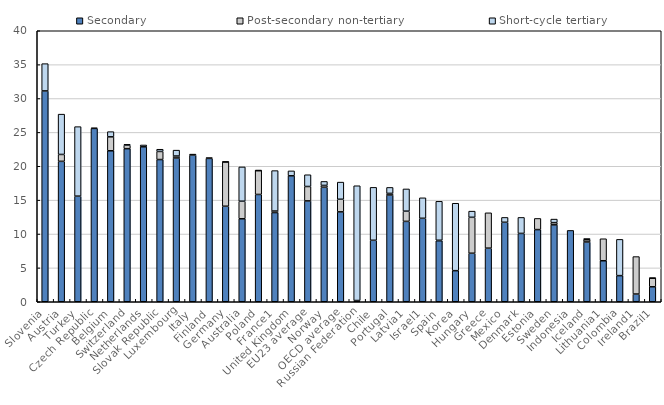
| Category | Secondary | Post-secondary non-tertiary | Short-cycle tertiary |
|---|---|---|---|
| Slovenia | 31.117 | 0 | 4.028 |
| Austria | 20.726 | 1.015 | 5.95 |
| Turkey | 15.587 | 0 | 10.261 |
| Czech Republic | 25.586 | 0 | 0.073 |
| Belgium | 22.284 | 2.057 | 0.768 |
| Switzerland | 22.596 | 0.524 | 0.111 |
| Netherlands | 22.87 | 0 | 0.271 |
| Slovak Republic | 20.991 | 1.194 | 0.328 |
| Luxembourg | 21.223 | 0.285 | 0.872 |
| Italy | 21.651 | 0 | 0.144 |
| Finland | 21.161 | 0.114 | 0 |
| Germany | 14.099 | 6.549 | 0.002 |
| Australia | 12.245 | 2.596 | 5.061 |
| Poland | 15.838 | 3.532 | 0.001 |
| France1 | 13.164 | 0.222 | 5.972 |
| United Kingdom | 18.589 | 0 | 0.727 |
| EU23 average | 14.886 | 2.127 | 1.734 |
| Norway | 16.894 | 0.275 | 0.59 |
| OECD average  | 13.268 | 1.859 | 2.533 |
| Russian Federation | 0 | 0.182 | 16.94 |
| Chile | 9.074 | 0 | 7.81 |
| Portugal | 15.763 | 0.231 | 0.881 |
| Latvia1 | 11.863 | 1.508 | 3.281 |
| Israel1 | 12.32 | 0 | 3.023 |
| Spain | 9.008 | 0.069 | 5.752 |
| Korea | 4.588 | 0 | 9.952 |
| Hungary | 7.16 | 5.303 | 0.912 |
| Greece | 7.911 | 5.218 | 0 |
| Mexico | 11.732 | 0 | 0.716 |
| Denmark | 10.087 | 0 | 2.36 |
| Estonia | 10.652 | 1.646 | 0 |
| Sweden | 11.35 | 0.328 | 0.524 |
| Indonesia | 10.53 | 0 | 0 |
| Iceland | 8.826 | 0.322 | 0.187 |
| Lithuania1 | 6.054 | 3.247 | 0 |
| Colombia | 3.858 | 0 | 5.35 |
| Ireland1 | 1.137 | 5.531 | 0 |
| Brazil1 | 2.208 | 1.285 | 0.003 |